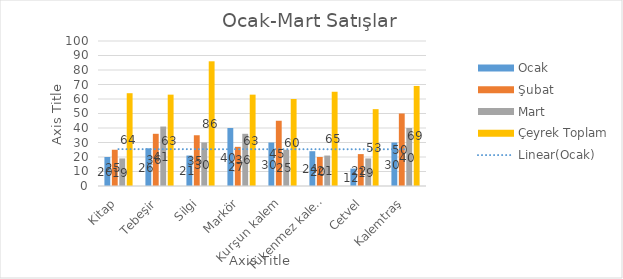
| Category | Ocak | Şubat | Mart | Çeyrek Toplam |
|---|---|---|---|---|
| Kitap | 20 | 25 | 19 | 64 |
| Tebeşir | 26 | 36 | 41 | 63 |
| Silgi | 21 | 35 | 30 | 86 |
| Markör | 40 | 27 | 36 | 63 |
| Kurşun kalem | 30 | 45 | 25 | 60 |
| Tükenmez kalem | 24 | 20 | 21 | 65 |
| Cetvel | 12 | 22 | 19 | 53 |
| Kalemtraş | 30 | 50 | 40 | 69 |